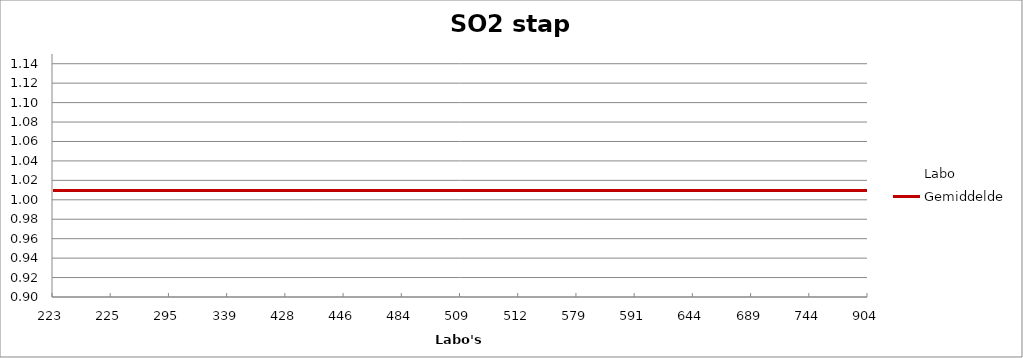
| Category | Labo | Gemiddelde |
|---|---|---|
| 223.0 | 1.059 | 1.009 |
| 225.0 | 1.016 | 1.009 |
| 295.0 | 0.999 | 1.009 |
| 339.0 | 1.008 | 1.009 |
| 428.0 | 1.111 | 1.009 |
| 446.0 | 0.965 | 1.009 |
| 484.0 | 1.016 | 1.009 |
| 509.0 | 0.982 | 1.009 |
| 512.0 | 0.991 | 1.009 |
| 579.0 | 0.991 | 1.009 |
| 591.0 | 1.034 | 1.009 |
| 644.0 | 1.008 | 1.009 |
| 689.0 | 1.008 | 1.009 |
| 744.0 | 1.051 | 1.009 |
| 904.0 | 0.939 | 1.009 |